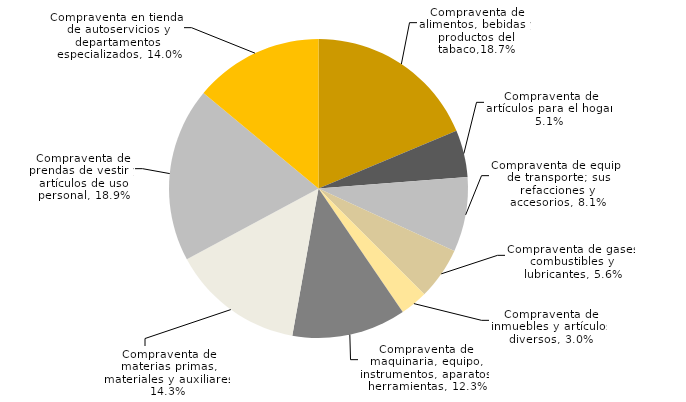
| Category | Series 0 |
|---|---|
| Compraventa de alimentos, bebidas y productos del tabaco. | 0.187 |
| Compraventa de artículos para el hogar. | 0.051 |
| Compraventa de equipo de transporte; sus refacciones y accesorios. | 0.081 |
| Compraventa de gases, combustibles y lubricantes. | 0.056 |
| Compraventa de inmuebles y artículos diversos. | 0.03 |
| Compraventa de maquinaria, equipo, instrumentos, aparatos, herramientas. | 0.123 |
| Compraventa de materias primas, materiales y auxiliares. | 0.143 |
| Compraventa de prendas de vestir y artículos de uso personal. | 0.189 |
| Compraventa en tiendas de autoservicios y departamentos especializados. | 0.14 |